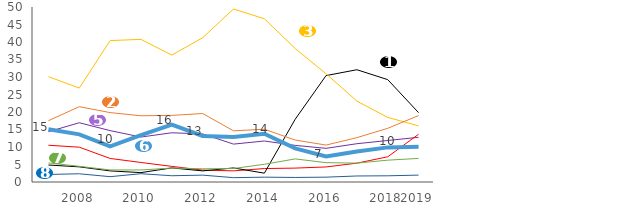
| Category | La santé (alimentation, SIDA, grippe et autres épidémies…) | L'environnement (pollution de l'air, pollution des sols, qualité de l'eau, …) | Le terrorisme, les attentats | Le chômage, la précarité de l'emploi | La délinquance | La pauvreté | La sécurité routière | Le racisme, la discrimination |
|---|---|---|---|---|---|---|---|---|
| nan | 14.36 | 10.5 | 4.85 | 30.1 | 15.07 | 17.51 | 2.16 | 5.45 |
| 2008.0 | 16.93 | 9.95 | 4.33 | 26.84 | 13.62 | 21.52 | 2.35 | 4.48 |
| nan | 14.68 | 6.73 | 3.17 | 40.41 | 10.21 | 19.83 | 1.52 | 3.45 |
| 2010.0 | 12.85 | 5.58 | 2.68 | 40.75 | 13.4 | 18.92 | 2.37 | 3.44 |
| nan | 14.06 | 4.46 | 4.03 | 36.26 | 16.38 | 19.03 | 1.79 | 3.98 |
| 2012.0 | 13.74 | 3.4 | 3.17 | 41.22 | 13.15 | 19.57 | 1.96 | 3.77 |
| nan | 10.83 | 3.18 | 4.02 | 49.43 | 12.84 | 14.62 | 1.24 | 3.85 |
| 2014.0 | 11.71 | 3.84 | 2.52 | 46.64 | 13.77 | 15.07 | 1.38 | 5.06 |
| nan | 10.46 | 3.97 | 17.93 | 38.14 | 9.61 | 11.99 | 1.3 | 6.6 |
| 2016.0 | 9.62 | 4.3 | 30.4 | 30.92 | 7.3 | 10.55 | 1.38 | 5.53 |
| nan | 10.94 | 5.38 | 32.08 | 23.11 | 8.71 | 12.67 | 1.72 | 5.39 |
| 2018.0 | 11.86 | 7.2 | 29.25 | 18.45 | 9.89 | 15.34 | 1.77 | 6.24 |
| 2019.0 | 12.771 | 13.644 | 19.814 | 16.037 | 10.048 | 18.978 | 1.973 | 6.741 |